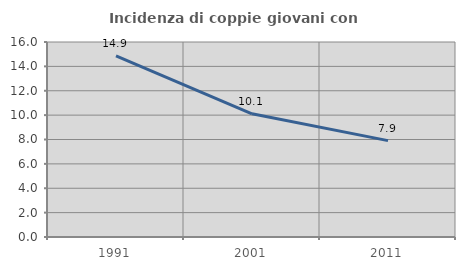
| Category | Incidenza di coppie giovani con figli |
|---|---|
| 1991.0 | 14.857 |
| 2001.0 | 10.106 |
| 2011.0 | 7.91 |